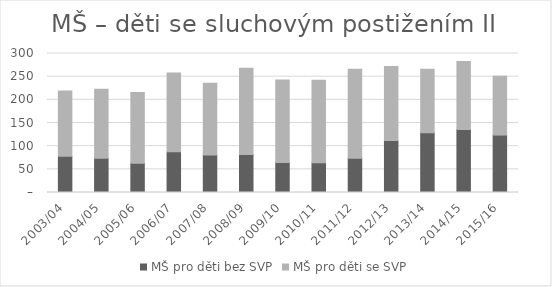
| Category | MŠ pro děti bez SVP | MŠ pro děti se SVP |
|---|---|---|
| 2003/04 | 78 | 141 |
| 2004/05 | 74 | 149 |
| 2005/06 | 63 | 153 |
| 2006/07 | 88 | 170 |
| 2007/08 | 81 | 155 |
| 2008/09 | 82 | 186 |
| 2009/10 | 65 | 178 |
| 2010/11 | 64 | 178 |
| 2011/12 | 74 | 192 |
| 2012/13 | 112 | 160 |
| 2013/14 | 129 | 137 |
| 2014/15 | 136 | 147 |
| 2015/16 | 124 | 127 |